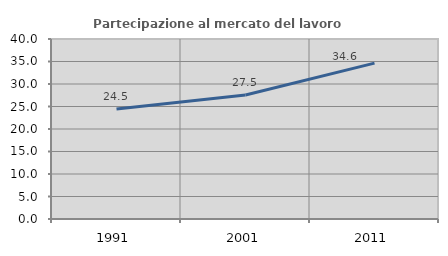
| Category | Partecipazione al mercato del lavoro  femminile |
|---|---|
| 1991.0 | 24.468 |
| 2001.0 | 27.545 |
| 2011.0 | 34.641 |